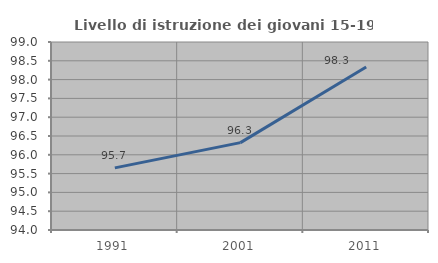
| Category | Livello di istruzione dei giovani 15-19 anni |
|---|---|
| 1991.0 | 95.652 |
| 2001.0 | 96.324 |
| 2011.0 | 98.333 |